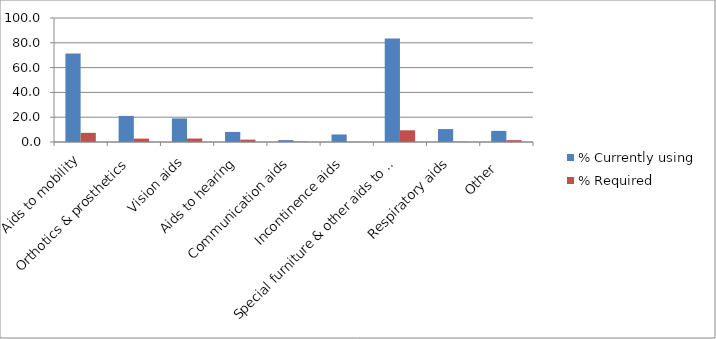
| Category | % Currently using | % Required |
|---|---|---|
| Aids to mobility | 71.393 | 7.395 |
| Orthotics & prosthetics | 21.024 | 2.755 |
| Vision aids | 19.037 | 2.798 |
| Aids to hearing | 8.119 | 1.899 |
| Communication aids | 1.522 | 0.29 |
| Incontinence aids | 6.075 | 0.101 |
| Special furniture & other aids to personal care | 83.544 | 9.439 |
| Respiratory aids | 10.425 | 0.232 |
| Other   | 8.96 | 1.493 |